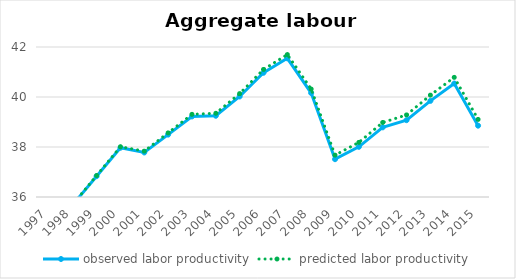
| Category | observed labor productivity | predicted labor productivity |
|---|---|---|
| 1997.0 | 34.711 | 34.711 |
| 1998.0 | 35.69 | 35.703 |
| 1999.0 | 36.832 | 36.858 |
| 2000.0 | 37.97 | 38.01 |
| 2001.0 | 37.781 | 37.835 |
| 2002.0 | 38.496 | 38.565 |
| 2003.0 | 39.222 | 39.307 |
| 2004.0 | 39.25 | 39.348 |
| 2005.0 | 40.021 | 40.135 |
| 2006.0 | 40.97 | 41.102 |
| 2007.0 | 41.548 | 41.697 |
| 2008.0 | 40.158 | 40.317 |
| 2009.0 | 37.512 | 37.674 |
| 2010.0 | 38.007 | 38.184 |
| 2011.0 | 38.787 | 38.982 |
| 2012.0 | 39.073 | 39.284 |
| 2013.0 | 39.845 | 40.074 |
| 2014.0 | 40.538 | 40.786 |
| 2015.0 | 38.853 | 39.104 |